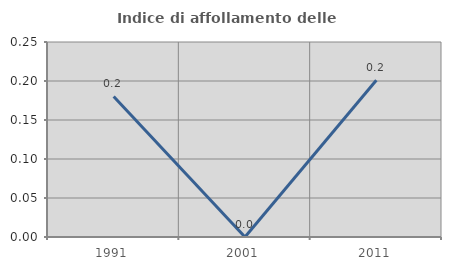
| Category | Indice di affollamento delle abitazioni  |
|---|---|
| 1991.0 | 0.18 |
| 2001.0 | 0 |
| 2011.0 | 0.201 |